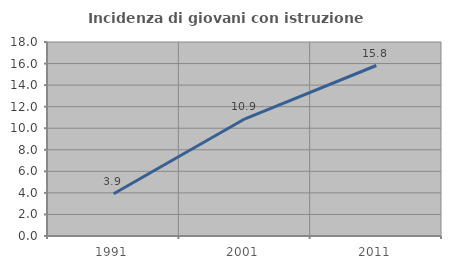
| Category | Incidenza di giovani con istruzione universitaria |
|---|---|
| 1991.0 | 3.915 |
| 2001.0 | 10.875 |
| 2011.0 | 15.819 |